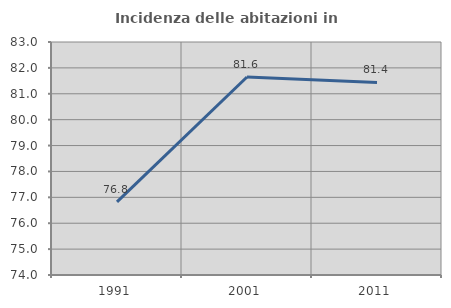
| Category | Incidenza delle abitazioni in proprietà  |
|---|---|
| 1991.0 | 76.824 |
| 2001.0 | 81.647 |
| 2011.0 | 81.437 |